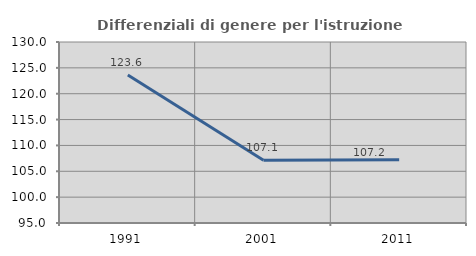
| Category | Differenziali di genere per l'istruzione superiore |
|---|---|
| 1991.0 | 123.637 |
| 2001.0 | 107.124 |
| 2011.0 | 107.214 |